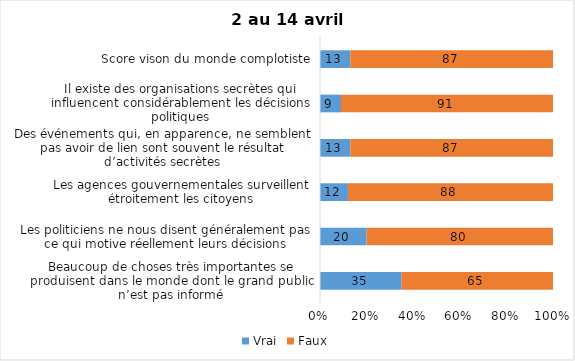
| Category | Vrai | Faux |
|---|---|---|
| Beaucoup de choses très importantes se produisent dans le monde dont le grand public n’est pas informé | 35 | 65 |
| Les politiciens ne nous disent généralement pas ce qui motive réellement leurs décisions | 20 | 80 |
| Les agences gouvernementales surveillent étroitement les citoyens | 12 | 88 |
| Des événements qui, en apparence, ne semblent pas avoir de lien sont souvent le résultat d’activités secrètes | 13 | 87 |
| Il existe des organisations secrètes qui influencent considérablement les décisions politiques | 9 | 91 |
| Score vison du monde complotiste | 13 | 87 |